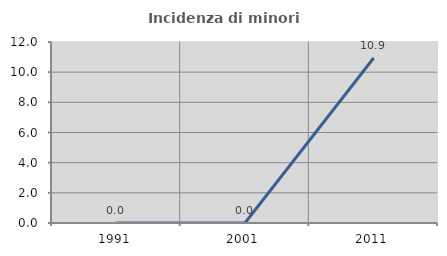
| Category | Incidenza di minori stranieri |
|---|---|
| 1991.0 | 0 |
| 2001.0 | 0 |
| 2011.0 | 10.938 |